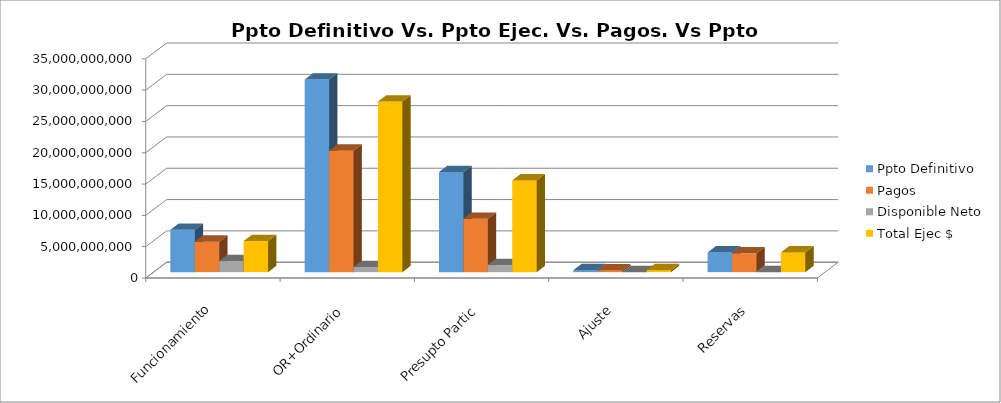
| Category | Ppto Definitivo | Pagos | Disponible Neto | Total Ejec $ |
|---|---|---|---|---|
| Funcionamiento | 6770315124 | 4873137809 | 1764998747 | 4966456473 |
| OR+Ordinario | 30754012200 | 19400129318 | 819573778 | 27230718548 |
| Presupto Partic | 15977926057 | 8534438623 | 1132184476 | 14650478179 |
| Ajuste | 322283190 | 284179373 | 0 | 322283190 |
| Reservas | 3151702590 | 3013528509 | 0 | 3151702590 |